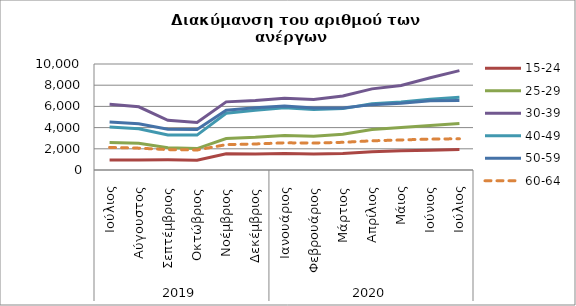
| Category | 15-24 | 25-29 | 30-39 | 40-49 | 50-59 | 60-64 |
|---|---|---|---|---|---|---|
| 0 | 937 | 2588 | 6199 | 4067 | 4524 | 2132 |
| 1 | 950 | 2528 | 5962 | 3895 | 4356 | 2062 |
| 2 | 960 | 2109 | 4687 | 3310 | 3846 | 1924 |
| 3 | 919 | 2022 | 4478 | 3293 | 3811 | 1886 |
| 4 | 1537 | 2970 | 6427 | 5355 | 5640 | 2393 |
| 5 | 1503 | 3082 | 6550 | 5646 | 5873 | 2456 |
| 6 | 1553 | 3257 | 6759 | 5874 | 6042 | 2564 |
| 7 | 1509 | 3191 | 6656 | 5700 | 5841 | 2544 |
| 8 | 1555 | 3375 | 6990 | 5790 | 5839 | 2611 |
| 9 | 1729 | 3820 | 7653 | 6252 | 6167 | 2755 |
| 10 | 1820 | 4016 | 7970 | 6420 | 6304 | 2833 |
| 11 | 1873 | 4195 | 8705 | 6676 | 6525 | 2919 |
| 12 | 1925 | 4395 | 9372 | 6856 | 6551 | 2946 |